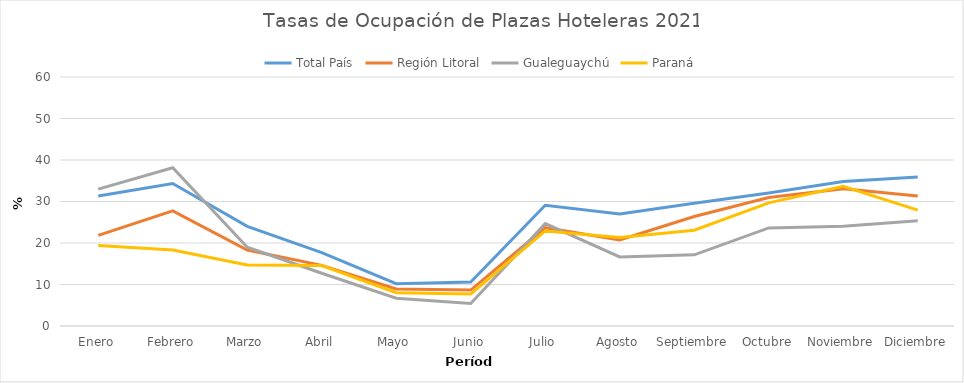
| Category | Total País | Región Litoral | Gualeguaychú | Paraná |
|---|---|---|---|---|
| Enero | 31.35 | 21.852 | 32.994 | 19.387 |
| Febrero | 34.329 | 27.73 | 38.131 | 18.327 |
| Marzo | 24.016 | 18.294 | 18.979 | 14.68 |
| Abril | 17.7 | 14.619 | 12.707 | 14.562 |
| Mayo | 10.2 | 8.928 | 6.686 | 8.024 |
| Junio | 10.6 | 8.666 | 5.444 | 7.704 |
| Julio | 29.1 | 23.684 | 24.667 | 22.902 |
| Agosto | 26.978 | 20.732 | 16.64 | 21.32 |
| Septiembre | 29.6 | 26.375 | 17.146 | 23.095 |
| Octubre | 32.035 | 30.94 | 23.63 | 29.682 |
| Noviembre | 34.8 | 33.045 | 24.064 | 33.684 |
| Diciembre | 35.9 | 31.308 | 25.388 | 27.93 |